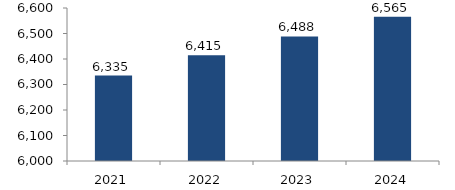
| Category | Bogotá |
|---|---|
| 2021.0 | 6334.909 |
| 2022.0 | 6414.832 |
| 2023.0 | 6488.332 |
| 2024.0 | 6565.464 |